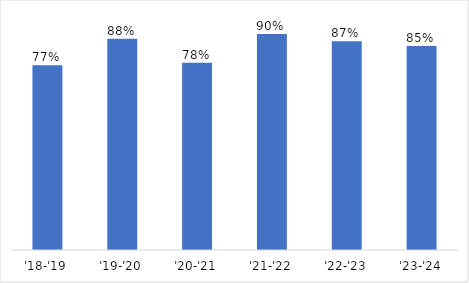
| Category | Retention |
|---|---|
| '18-'19 | 0.77 |
| '19-'20 | 0.88 |
| '20-'21 | 0.78 |
| '21-'22 | 0.9 |
| '22-'23 | 0.87 |
| '23-'24 | 0.85 |